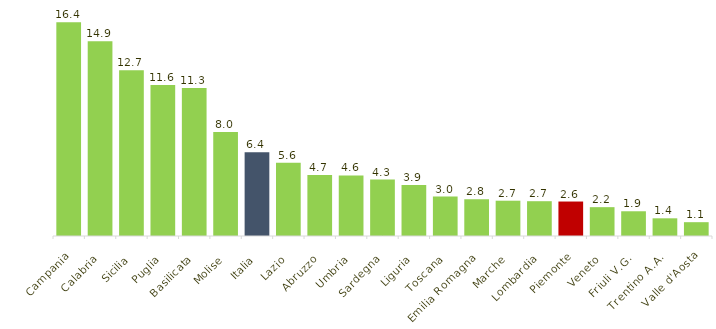
| Category | % |
|---|---|
| Campania | 16.371 |
| Calabria | 14.912 |
| Sicilia | 12.694 |
| Puglia | 11.566 |
| Basilicata | 11.332 |
| Molise | 7.964 |
| Italia | 6.419 |
| Lazio | 5.605 |
| Abruzzo | 4.673 |
| Umbria | 4.635 |
| Sardegna | 4.327 |
| Liguria | 3.898 |
| Toscana | 3.017 |
| Emilia Romagna | 2.813 |
| Marche | 2.703 |
| Lombardia | 2.665 |
| Piemonte | 2.64 |
| Veneto | 2.209 |
| Friuli V.G. | 1.894 |
| Trentino A.A. | 1.355 |
| Valle d'Aosta | 1.058 |